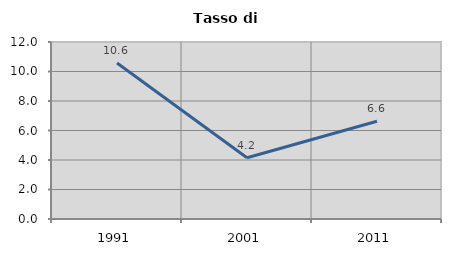
| Category | Tasso di disoccupazione   |
|---|---|
| 1991.0 | 10.573 |
| 2001.0 | 4.15 |
| 2011.0 | 6.632 |